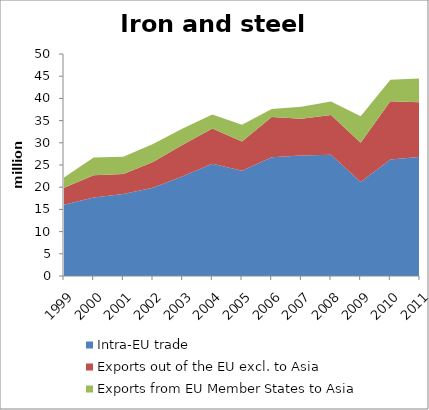
| Category | Intra-EU trade | Exports out of the EU excl. to Asia | Exports from EU Member States to Asia |
|---|---|---|---|
| 1999.0 | 16.022 | 3.865 | 2.301 |
| 2000.0 | 17.666 | 5.022 | 3.984 |
| 2001.0 | 18.446 | 4.506 | 3.916 |
| 2002.0 | 19.853 | 5.84 | 4.016 |
| 2003.0 | 22.448 | 7.096 | 3.653 |
| 2004.0 | 25.264 | 7.97 | 3.143 |
| 2005.0 | 23.678 | 6.634 | 3.778 |
| 2006.0 | 26.767 | 9.039 | 1.817 |
| 2007.0 | 27.162 | 8.273 | 2.664 |
| 2008.0 | 27.322 | 8.924 | 3.082 |
| 2009.0 | 21.191 | 8.806 | 5.982 |
| 2010.0 | 26.231 | 13.103 | 4.84 |
| 2011.0 | 26.847 | 12.29 | 5.33 |